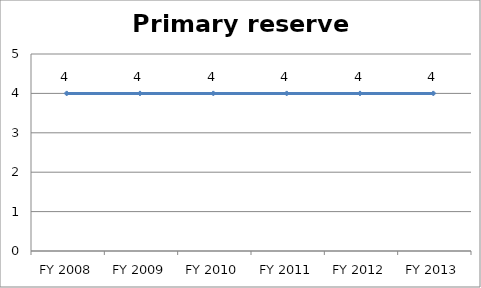
| Category | Primary reserve score |
|---|---|
| FY 2013 | 4 |
| FY 2012 | 4 |
| FY 2011 | 4 |
| FY 2010 | 4 |
| FY 2009 | 4 |
| FY 2008 | 4 |